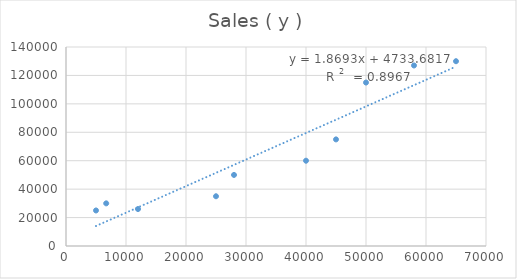
| Category | Sales ( y ) |
|---|---|
| 5000.0 | 25000 |
| 6700.0 | 30000 |
| 12000.0 | 26000 |
| 25000.0 | 35000 |
| 28000.0 | 50000 |
| 40000.0 | 60000 |
| 45000.0 | 75000 |
| 50000.0 | 115000 |
| 58000.0 | 127000 |
| 65000.0 | 130000 |